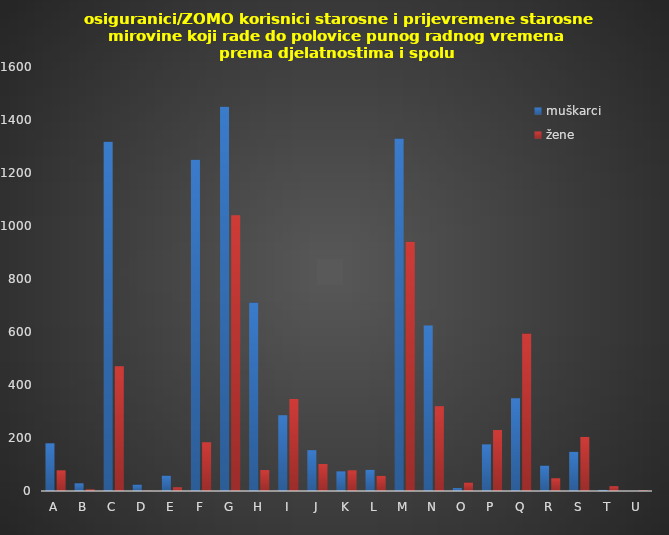
| Category | muškarci | žene |
|---|---|---|
| A | 180 | 78 |
| B | 29 | 6 |
| C | 1318 | 471 |
| D | 24 | 1 |
| E | 58 | 14 |
| F | 1250 | 184 |
| G | 1450 | 1041 |
| H | 711 | 79 |
| I | 286 | 347 |
| J | 154 | 102 |
| K | 74 | 78 |
| L | 80 | 57 |
| M | 1330 | 941 |
| N | 625 | 320 |
| O | 11 | 32 |
| P | 176 | 230 |
| Q | 350 | 594 |
| R | 96 | 48 |
| S | 148 | 204 |
| T | 4 | 18 |
| U | 0 | 2 |